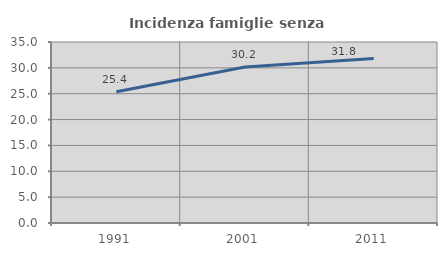
| Category | Incidenza famiglie senza nuclei |
|---|---|
| 1991.0 | 25.363 |
| 2001.0 | 30.158 |
| 2011.0 | 31.803 |